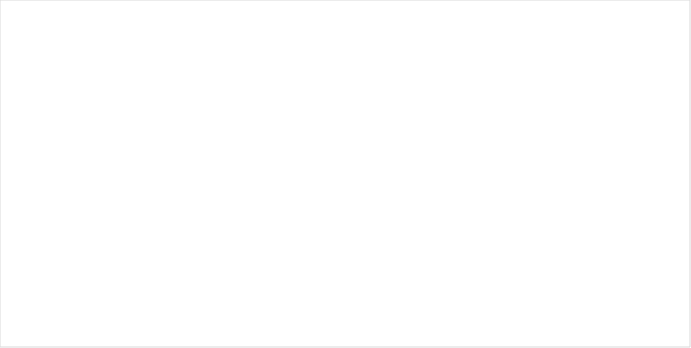
| Category | Peso |
|---|---|
| Plastic (Fishing) | 0 |
| Pl. (Consumption) | 0 |
| Pl. (Everyday use) | 0 |
| Pl. Particulate | 0 |
| Rubber | 0 |
| Fabric | 0 |
| Paper and cardboard | 0 |
| Wood | 0 |
| Metal | 0 |
| Glass | 0 |
| Ceramics | 0 |
| health and medical | 0 |
| Others | 0 |